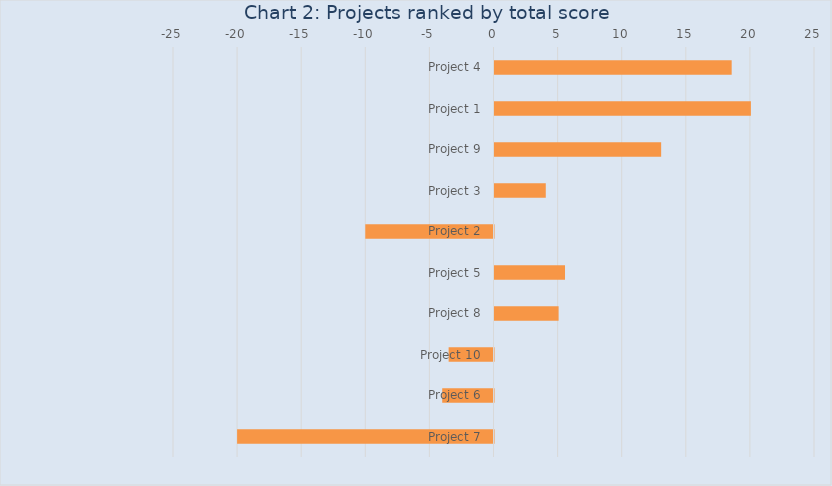
| Category | Series 0 |
|---|---|
| Project 4 | 18.5 |
| Project 1 | 20 |
| Project 9 | 13 |
| Project 3 | 4 |
| Project 2 | -10 |
| Project 5 | 5.5 |
| Project 8 | 5 |
| Project 10 | -3.5 |
| Project 6 | -4 |
| Project 7 | -20 |